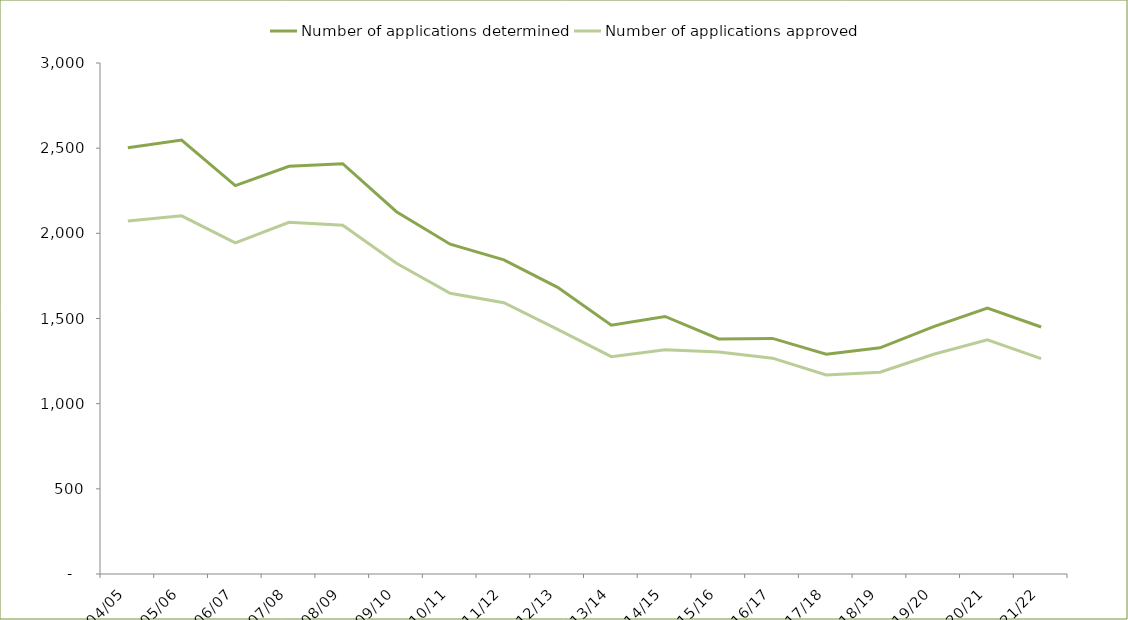
| Category | Number of applications determined | Number of applications approved |
|---|---|---|
| 2004/05 | 2503 | 2072 |
| 2005/06 | 2548 | 2103 |
| 2006/07 | 2280 | 1944 |
| 2007/08 | 2394 | 2065 |
| 2008/09 | 2409 | 2047 |
| 2009/10 | 2127 | 1824 |
| 2010/11 | 1936 | 1648 |
| 2011/12 | 1844 | 1593 |
| 2012/13 | 1683 | 1436 |
| 2013/14 | 1461 | 1276 |
| 2014/15 | 1512 | 1317 |
| 2015/16 | 1380 | 1303 |
| 2016/17 | 1383 | 1267 |
| 2017/18 | 1290 | 1169 |
| 2018/19 | 1328 | 1185 |
| 2019/20 | 1452 | 1290 |
| 2020/21 | 1561 | 1375 |
| 2021/22 | 1450 | 1264 |